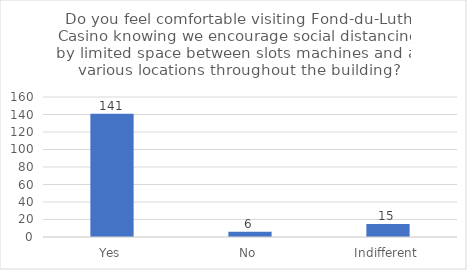
| Category | Series 0 |
|---|---|
| Yes | 141 |
| No | 6 |
| Indifferent | 15 |